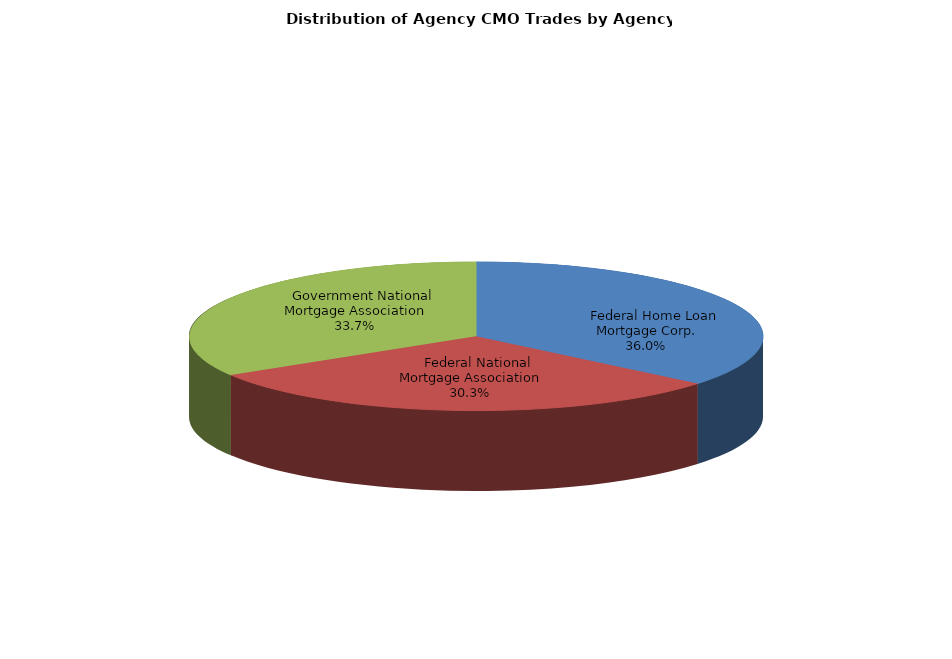
| Category | Series 0 |
|---|---|
|     Federal Home Loan Mortgage Corp. | 448.714 |
|     Federal National Mortgage Association | 378.135 |
|     Government National Mortgage Association | 420.484 |